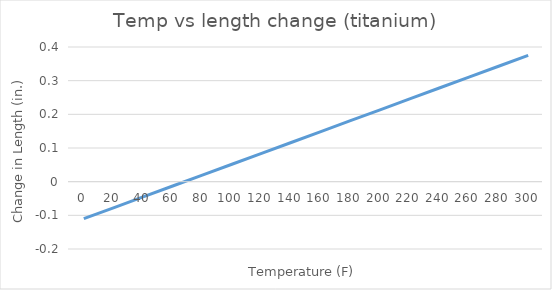
| Category | Temp vs length change |
|---|---|
| 0.0 | -0.11 |
| 20.0 | -0.078 |
| 40.0 | -0.045 |
| 60.0 | -0.013 |
| 80.0 | 0.019 |
| 100.0 | 0.052 |
| 120.0 | 0.084 |
| 140.0 | 0.116 |
| 160.0 | 0.149 |
| 180.0 | 0.181 |
| 200.0 | 0.213 |
| 220.0 | 0.246 |
| 240.0 | 0.278 |
| 260.0 | 0.31 |
| 280.0 | 0.343 |
| 300.0 | 0.375 |